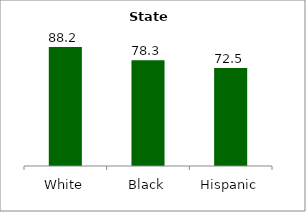
| Category | Series 0 |
|---|---|
| White | 88.231 |
| Black | 78.334 |
| Hispanic | 72.507 |